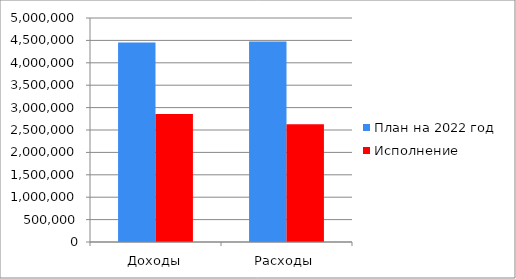
| Category | План на 2022 год | Исполнение |
|---|---|---|
| Доходы | 4450813.67 | 2857444.49 |
| Расходы | 4473918.17 | 2630271.22 |